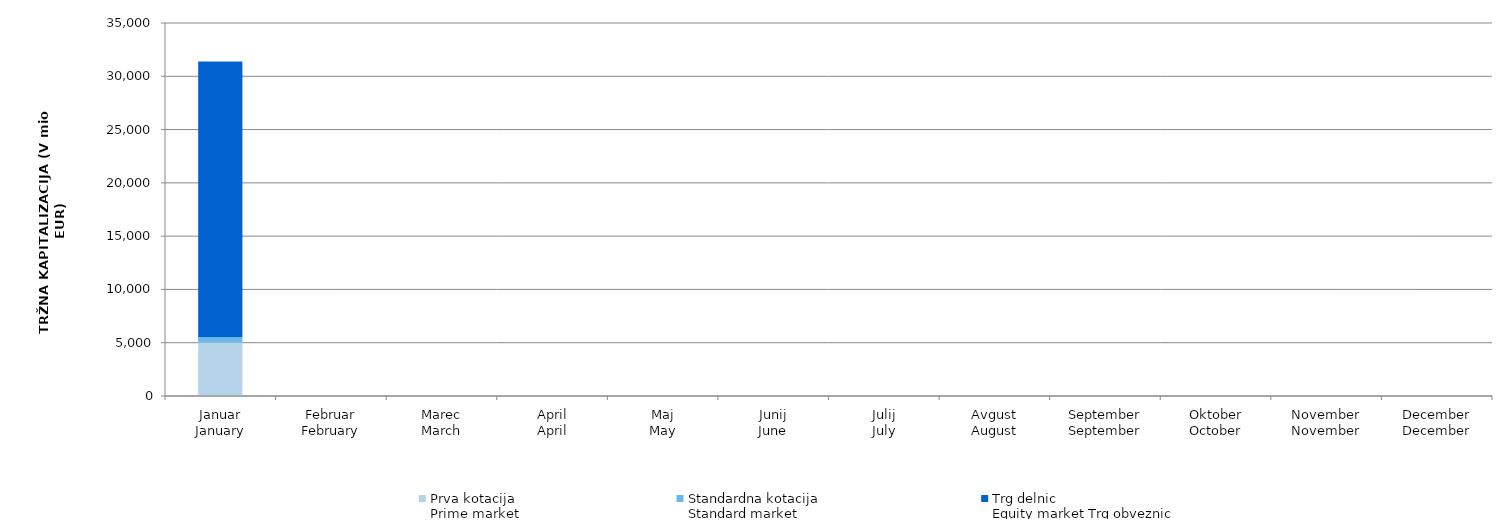
| Category | Prva kotacija
Prime market | Standardna kotacija
Standard market | Trg delnic
Equity market |
|---|---|---|---|
| Januar
January | 5022.792 | 483.67 | 25885.901 |
| Februar
February | 0 | 0 | 0 |
| Marec
March | 0 | 0 | 0 |
| April
April | 0 | 0 | 0 |
| Maj
May | 0 | 0 | 0 |
| Junij
June | 0 | 0 | 0 |
| Julij
July | 0 | 0 | 0 |
| Avgust
August | 0 | 0 | 0 |
| September
September | 0 | 0 | 0 |
| Oktober
October | 0 | 0 | 0 |
| November
November | 0 | 0 | 0 |
| December
December | 0 | 0 | 0 |